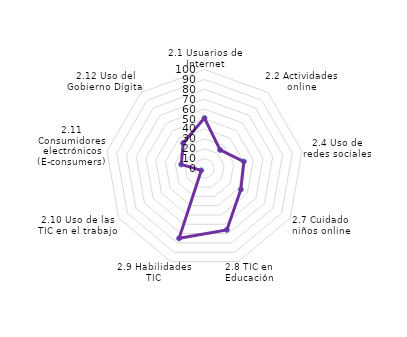
| Category | BOGOTÁ D.C. |
|---|---|
| 2.1 Usuarios de Internet | 50.925 |
| 2.2 Actividades online | 24.495 |
| 2.4 Uso de redes sociales | 40.357 |
| 2.7 Cuidado niños online | 42.4 |
| 2.8 TIC en Educación | 65.989 |
| 2.9 Habilidades TIC | 75.071 |
| 2.10 Uso de las TIC en el trabajo | 3.8 |
| 2.11 Consumidores electrónicos (E-consumers) | 23.841 |
| 2.12 Uso del Gobierno Digital | 33.475 |